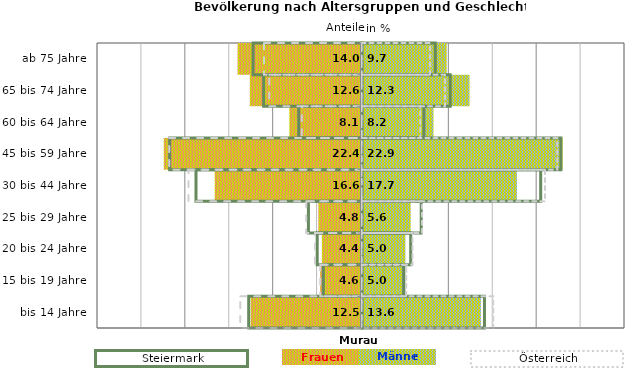
| Category | Frauen | Männer | Frauen Spalte2 | Männer Spalte2 | Frauen Spalte3 | Männer Spalte3 |
|---|---|---|---|---|---|---|
| bis 14 Jahre | -12.5 | 13.6 | 14 | -12.9 | -13.8 | 15 |
| 15 bis 19 Jahre | -4.6 | 5 | 4.8 | -4.4 | -4.7 | 5.1 |
| 20 bis 24 Jahre | -4.4 | 5 | 5.6 | -5.1 | -5.3 | 5.8 |
| 25 bis 29 Jahre | -4.8 | 5.6 | 6.8 | -6.1 | -6.3 | 6.9 |
| 30 bis 44 Jahre | -16.6 | 17.7 | 20.4 | -18.9 | -19.7 | 20.9 |
| 45 bis 59 Jahre | -22.4 | 22.9 | 22.7 | -21.9 | -21.9 | 22.3 |
| 60 bis 64 Jahre | -8.1 | 8.2 | 7.1 | -7.2 | -6.8 | 6.7 |
| 65 bis 74 Jahre | -12.6 | 12.3 | 10.1 | -11.2 | -10.5 | 9.5 |
| ab 75 Jahre | -14 | 9.7 | 8.4 | -12.4 | -11.1 | 7.8 |